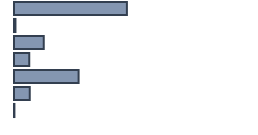
| Category | Percentatge |
|---|---|
| 0 | 47.043 |
| 1 | 0.609 |
| 2 | 12.348 |
| 3 | 6.304 |
| 4 | 26.913 |
| 5 | 6.609 |
| 6 | 0.174 |